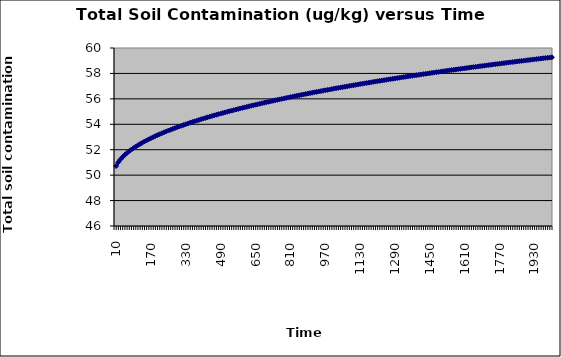
| Category | Series 0 |
|---|---|
| 10.0 | 50.717 |
| 20.0 | 51.012 |
| 30.0 | 51.237 |
| 40.0 | 51.426 |
| 50.0 | 51.592 |
| 60.0 | 51.742 |
| 70.0 | 51.88 |
| 80.0 | 52.008 |
| 90.0 | 52.127 |
| 100.0 | 52.24 |
| 110.0 | 52.348 |
| 120.0 | 52.45 |
| 130.0 | 52.548 |
| 140.0 | 52.642 |
| 150.0 | 52.733 |
| 160.0 | 52.82 |
| 170.0 | 52.905 |
| 180.0 | 52.987 |
| 190.0 | 53.067 |
| 200.0 | 53.144 |
| 210.0 | 53.22 |
| 220.0 | 53.293 |
| 230.0 | 53.365 |
| 240.0 | 53.435 |
| 250.0 | 53.504 |
| 260.0 | 53.571 |
| 270.0 | 53.637 |
| 280.0 | 53.702 |
| 290.0 | 53.765 |
| 300.0 | 53.827 |
| 310.0 | 53.888 |
| 320.0 | 53.948 |
| 330.0 | 54.007 |
| 340.0 | 54.065 |
| 350.0 | 54.122 |
| 360.0 | 54.178 |
| 370.0 | 54.234 |
| 380.0 | 54.288 |
| 390.0 | 54.342 |
| 400.0 | 54.395 |
| 410.0 | 54.447 |
| 420.0 | 54.499 |
| 430.0 | 54.55 |
| 440.0 | 54.6 |
| 450.0 | 54.65 |
| 460.0 | 54.699 |
| 470.0 | 54.747 |
| 480.0 | 54.795 |
| 490.0 | 54.843 |
| 500.0 | 54.889 |
| 510.0 | 54.936 |
| 520.0 | 54.981 |
| 530.0 | 55.027 |
| 540.0 | 55.072 |
| 550.0 | 55.116 |
| 560.0 | 55.16 |
| 570.0 | 55.203 |
| 580.0 | 55.246 |
| 590.0 | 55.289 |
| 600.0 | 55.331 |
| 610.0 | 55.373 |
| 620.0 | 55.414 |
| 630.0 | 55.455 |
| 640.0 | 55.496 |
| 650.0 | 55.536 |
| 660.0 | 55.576 |
| 670.0 | 55.616 |
| 680.0 | 55.655 |
| 690.0 | 55.694 |
| 700.0 | 55.733 |
| 710.0 | 55.771 |
| 720.0 | 55.809 |
| 730.0 | 55.847 |
| 740.0 | 55.885 |
| 750.0 | 55.922 |
| 760.0 | 55.959 |
| 770.0 | 55.995 |
| 780.0 | 56.031 |
| 790.0 | 56.067 |
| 800.0 | 56.103 |
| 810.0 | 56.139 |
| 820.0 | 56.174 |
| 830.0 | 56.209 |
| 840.0 | 56.244 |
| 850.0 | 56.278 |
| 860.0 | 56.313 |
| 870.0 | 56.347 |
| 880.0 | 56.38 |
| 890.0 | 56.414 |
| 900.0 | 56.447 |
| 910.0 | 56.481 |
| 920.0 | 56.514 |
| 930.0 | 56.546 |
| 940.0 | 56.579 |
| 950.0 | 56.611 |
| 960.0 | 56.643 |
| 970.0 | 56.675 |
| 980.0 | 56.707 |
| 990.0 | 56.738 |
| 1000.0 | 56.77 |
| 1010.0 | 56.801 |
| 1020.0 | 56.832 |
| 1030.0 | 56.863 |
| 1040.0 | 56.893 |
| 1050.0 | 56.924 |
| 1060.0 | 56.954 |
| 1070.0 | 56.984 |
| 1080.0 | 57.014 |
| 1090.0 | 57.044 |
| 1100.0 | 57.073 |
| 1110.0 | 57.103 |
| 1120.0 | 57.132 |
| 1130.0 | 57.161 |
| 1140.0 | 57.19 |
| 1150.0 | 57.219 |
| 1160.0 | 57.248 |
| 1170.0 | 57.276 |
| 1180.0 | 57.305 |
| 1190.0 | 57.333 |
| 1200.0 | 57.361 |
| 1210.0 | 57.389 |
| 1220.0 | 57.417 |
| 1230.0 | 57.444 |
| 1240.0 | 57.472 |
| 1250.0 | 57.499 |
| 1260.0 | 57.526 |
| 1270.0 | 57.553 |
| 1280.0 | 57.58 |
| 1290.0 | 57.607 |
| 1300.0 | 57.634 |
| 1310.0 | 57.661 |
| 1320.0 | 57.687 |
| 1330.0 | 57.713 |
| 1340.0 | 57.74 |
| 1350.0 | 57.766 |
| 1360.0 | 57.792 |
| 1370.0 | 57.818 |
| 1380.0 | 57.843 |
| 1390.0 | 57.869 |
| 1400.0 | 57.894 |
| 1410.0 | 57.92 |
| 1420.0 | 57.945 |
| 1430.0 | 57.97 |
| 1440.0 | 57.995 |
| 1450.0 | 58.02 |
| 1460.0 | 58.045 |
| 1470.0 | 58.07 |
| 1480.0 | 58.095 |
| 1490.0 | 58.119 |
| 1500.0 | 58.144 |
| 1510.0 | 58.168 |
| 1520.0 | 58.192 |
| 1530.0 | 58.216 |
| 1540.0 | 58.24 |
| 1550.0 | 58.264 |
| 1560.0 | 58.288 |
| 1570.0 | 58.312 |
| 1580.0 | 58.335 |
| 1590.0 | 58.359 |
| 1600.0 | 58.382 |
| 1610.0 | 58.406 |
| 1620.0 | 58.429 |
| 1630.0 | 58.452 |
| 1640.0 | 58.475 |
| 1650.0 | 58.498 |
| 1660.0 | 58.521 |
| 1670.0 | 58.544 |
| 1680.0 | 58.566 |
| 1690.0 | 58.589 |
| 1700.0 | 58.612 |
| 1710.0 | 58.634 |
| 1720.0 | 58.656 |
| 1730.0 | 58.679 |
| 1740.0 | 58.701 |
| 1750.0 | 58.723 |
| 1760.0 | 58.745 |
| 1770.0 | 58.767 |
| 1780.0 | 58.789 |
| 1790.0 | 58.811 |
| 1800.0 | 58.832 |
| 1810.0 | 58.854 |
| 1820.0 | 58.876 |
| 1830.0 | 58.897 |
| 1840.0 | 58.918 |
| 1850.0 | 58.94 |
| 1860.0 | 58.961 |
| 1870.0 | 58.982 |
| 1880.0 | 59.003 |
| 1890.0 | 59.024 |
| 1900.0 | 59.045 |
| 1910.0 | 59.066 |
| 1920.0 | 59.087 |
| 1930.0 | 59.108 |
| 1940.0 | 59.128 |
| 1950.0 | 59.149 |
| 1960.0 | 59.169 |
| 1970.0 | 59.19 |
| 1980.0 | 59.21 |
| 1990.0 | 59.23 |
| 2000.0 | 59.251 |
| 2010.0 | 59.271 |